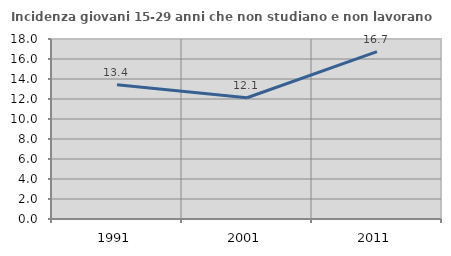
| Category | Incidenza giovani 15-29 anni che non studiano e non lavorano  |
|---|---|
| 1991.0 | 13.428 |
| 2001.0 | 12.128 |
| 2011.0 | 16.737 |